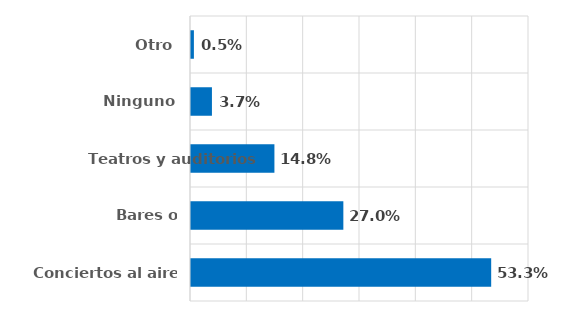
| Category | Series 0 |
|---|---|
| Conciertos al aire libre | 0.533 |
| Bares o restaurantes | 0.27 |
| Teatros y auditorios | 0.148 |
| Ninguno | 0.037 |
| Otro | 0.005 |